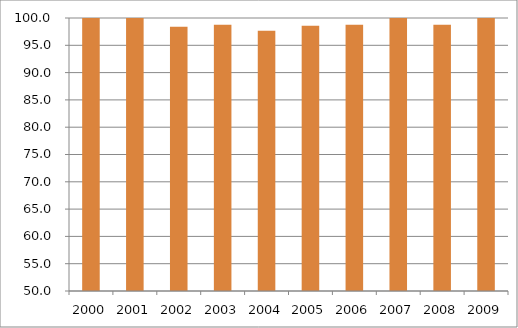
| Category | Região Sudeste |
|---|---|
| 2000.0 | 102.07 |
| 2001.0 | 100.79 |
| 2002.0 | 98.42 |
| 2003.0 | 98.75 |
| 2004.0 | 97.68 |
| 2005.0 | 98.56 |
| 2006.0 | 98.76 |
| 2007.0 | 102.15 |
| 2008.0 | 98.75 |
| 2009.0 | 100.15 |